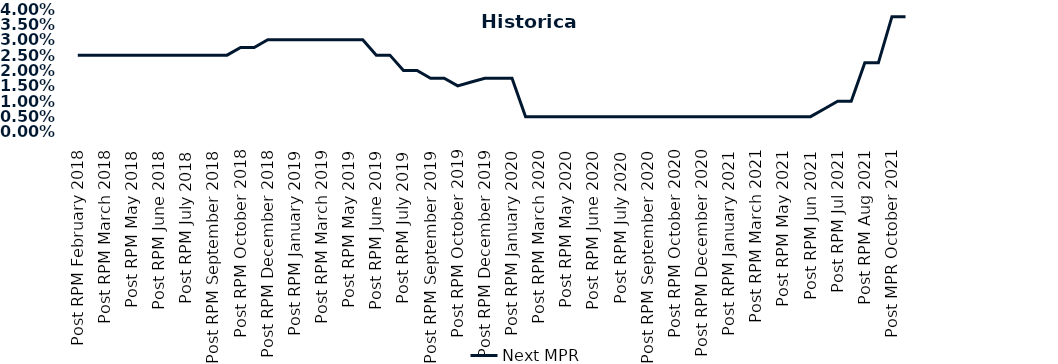
| Category | Next MPR |
|---|---|
| Post RPM February 2018 | 0.025 |
| Pre RPM March 2018 | 0.025 |
| Post RPM March 2018 | 0.025 |
| Pre RPM May 2018 | 0.025 |
| Post RPM May 2018 | 0.025 |
| Pre RPM June 2018 | 0.025 |
| Post RPM June 2018 | 0.025 |
| Pre RPM July 2018 | 0.025 |
| Post RPM July 2018 | 0.025 |
| Pre RPM September 2018 | 0.025 |
| Post RPM September 2018 | 0.025 |
| Pre RPM October 2018 | 0.025 |
| Post RPM October 2018 | 0.028 |
| Pre RPM December 2018 | 0.028 |
| Post RPM December 2018 | 0.03 |
| Pre RPM January 2019 | 0.03 |
| Post RPM January 2019 | 0.03 |
| Pre RPM March 2019 | 0.03 |
| Post RPM March 2019 | 0.03 |
| Pre RPM May 2019 | 0.03 |
| Post RPM May 2019 | 0.03 |
| Pre RPM June 2019 | 0.03 |
| Post RPM June 2019 | 0.025 |
| Pre RPM July 2019 | 0.025 |
| Post RPM July 2019 | 0.02 |
| Pre RPM September 2019 | 0.02 |
| Post RPM September 2019 | 0.018 |
| Pre RPM October 2019 | 0.018 |
| Post RPM October 2019 | 0.015 |
| Pre RPM December 2019 | 0.016 |
| Post RPM December 2019 | 0.018 |
| Pre RPM January 2020 | 0.018 |
| Post RPM January 2020 | 0.018 |
| Pre RPM March 2020 | 0.005 |
| Post RPM March 2020 | 0.005 |
| Pre RPM May 2020 | 0.005 |
| Post RPM May 2020 | 0.005 |
| Pre RPM June 2020 | 0.005 |
| Post RPM June 2020 | 0.005 |
| Pre RPM July 2020 | 0.005 |
| Post RPM July 2020 | 0.005 |
| Pre RPM September 2020 | 0.005 |
| Post RPM September 2020 | 0.005 |
| Pre RPM October 2020 | 0.005 |
| Post RPM October 2020 | 0.005 |
| Pre RPM December 2020 | 0.005 |
|  Post RPM December 2020 | 0.005 |
| Pre RPM January 2021 | 0.005 |
| Post RPM January 2021 | 0.005 |
|  Pre RPM March 2021 | 0.005 |
|  Post RPM March 2021 | 0.005 |
|  Pre RPM May 2021 | 0.005 |
|  Post RPM May 2021 | 0.005 |
|  Pre RPM Jun 2021 | 0.005 |
|   Post RPM Jun 2021 | 0.005 |
| Pre RPM Jul 2021 | 0.008 |
|  Post RPM Jul 2021 | 0.01 |
| Pre RPM Aug 2021 | 0.01 |
|  Post RPM Aug 2021 | 0.022 |
| Pre MPR October 2021 | 0.022 |
| Post MPR October 2021 | 0.038 |
| Pre MPR December 2021 | 0.038 |